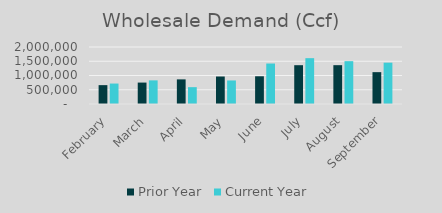
| Category | Prior Year | Current Year |
|---|---|---|
| February | 661790 | 717715 |
| March | 751769 | 829129 |
| April | 864122 | 591056.98 |
| May | 964707 | 825870 |
| June | 973004 | 1420311.82 |
| July | 1361707 | 1608413.16 |
| August | 1362622 | 1503128.42 |
| September | 1117474 | 1450543.6 |